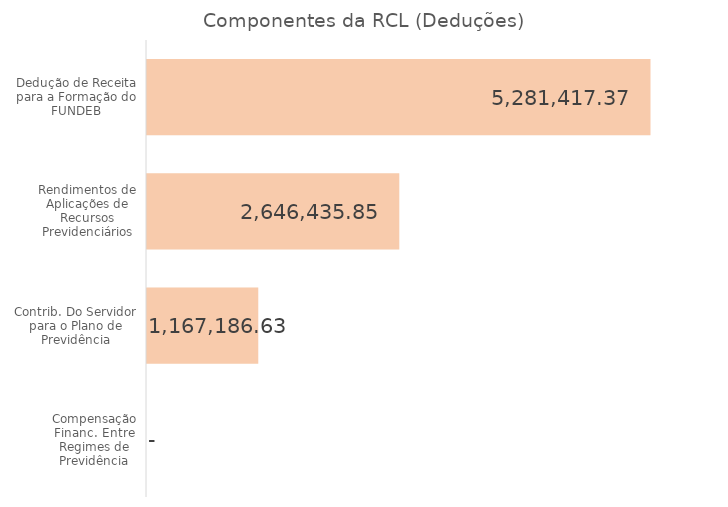
| Category | Valor |
|---|---|
| Dedução de Receita para a Formação do FUNDEB | 5281417.37 |
| Rendimentos de Aplicações de Recursos Previdenciários | 2646435.85 |
| Contrib. Do Servidor para o Plano de Previdência | 1167186.63 |
| Compensação Financ. Entre Regimes de Previdência | 0 |